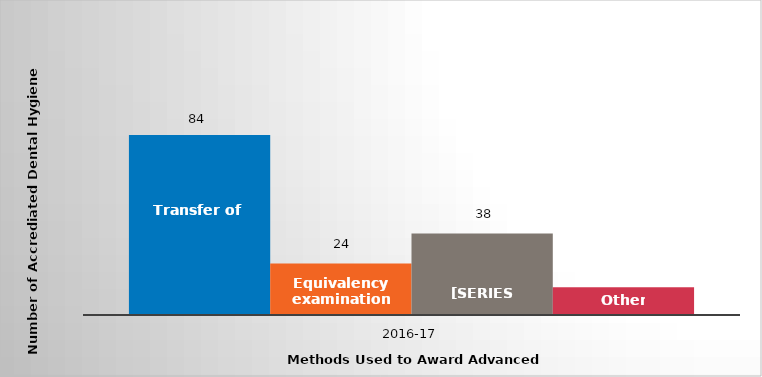
| Category | Transfer of credit | Equivalency examinations | Challenge examinations | Other |
|---|---|---|---|---|
| 2016-17 | 84 | 24 | 38 | 13 |